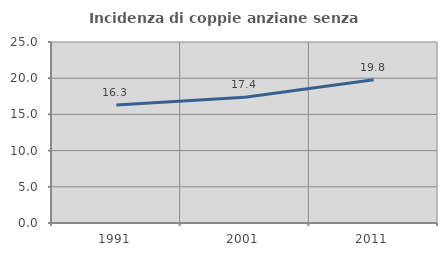
| Category | Incidenza di coppie anziane senza figli  |
|---|---|
| 1991.0 | 16.284 |
| 2001.0 | 17.377 |
| 2011.0 | 19.774 |